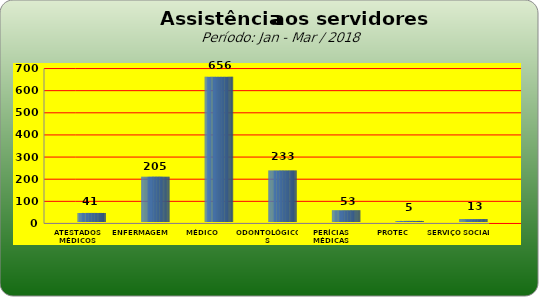
| Category | Series 0 |
|---|---|
| ATESTADOS MÉDICOS | 41 |
| ENFERMAGEM | 205 |
| MÉDICO | 656 |
| ODONTOLÓGICOS | 233 |
| PERÍCIAS MÉDICAS | 53 |
| PROTEC | 5 |
| SERVIÇO SOCIAL | 13 |